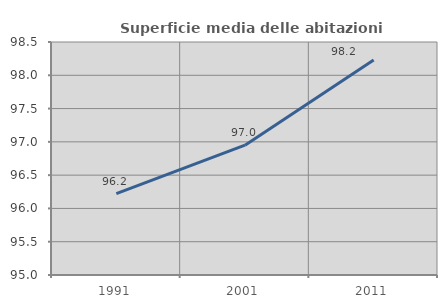
| Category | Superficie media delle abitazioni occupate |
|---|---|
| 1991.0 | 96.222 |
| 2001.0 | 96.951 |
| 2011.0 | 98.23 |